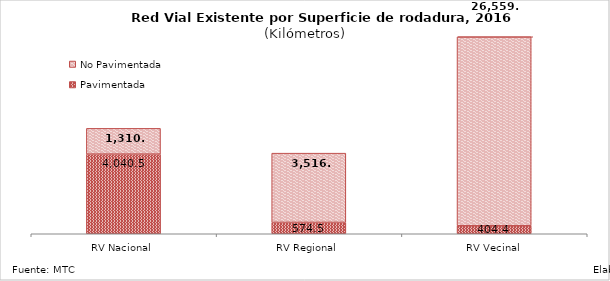
| Category | Pavimentada | No Pavimentada |
|---|---|---|
| RV Nacional | 4040.461 | 1310.175 |
| RV Regional | 574.532 | 3516.687 |
| RV Vecinal | 404.431 | 26559.371 |